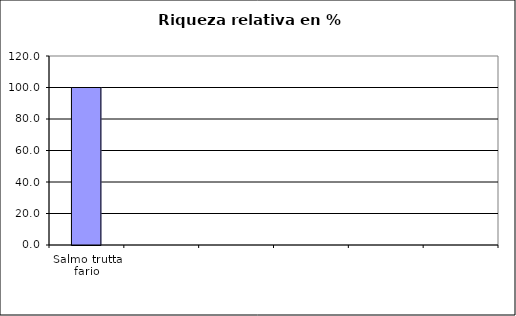
| Category | Series 0 |
|---|---|
| Salmo trutta fario | 100 |